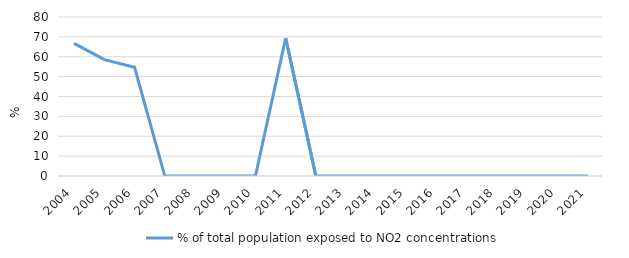
| Category | % of total population exposed to NO2 concentrations  |
|---|---|
| 2004.0 | 66.732 |
| 2005.0 | 58.522 |
| 2006.0 | 54.725 |
| 2007.0 | 0 |
| 2008.0 | 0 |
| 2009.0 | 0 |
| 2010.0 | 0 |
| 2011.0 | 69.376 |
| 2012.0 | 0 |
| 2013.0 | 0 |
| 2014.0 | 0 |
| 2015.0 | 0 |
| 2016.0 | 0 |
| 2017.0 | 0 |
| 2018.0 | 0 |
| 2019.0 | 0 |
| 2020.0 | 0 |
| 2021.0 | 0 |